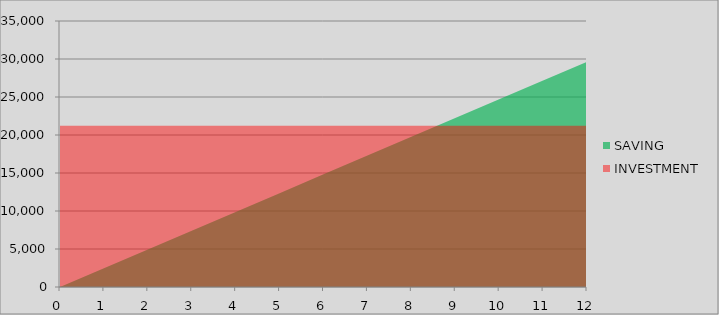
| Category | SAVING | INVESTMENT |
|---|---|---|
| 0.0 | 0 | 21220 |
| 1.0 | 2470 | 21220 |
| 2.0 | 4940 | 21220 |
| 3.0 | 7410 | 21220 |
| 4.0 | 9880 | 21220 |
| 5.0 | 12350 | 21220 |
| 6.0 | 14820 | 21220 |
| 7.0 | 17290 | 21220 |
| 8.0 | 19760 | 21220 |
| 9.0 | 22230 | 21220 |
| 10.0 | 24700 | 21220 |
| 11.0 | 27170 | 21220 |
| 12.0 | 29640 | 21220 |